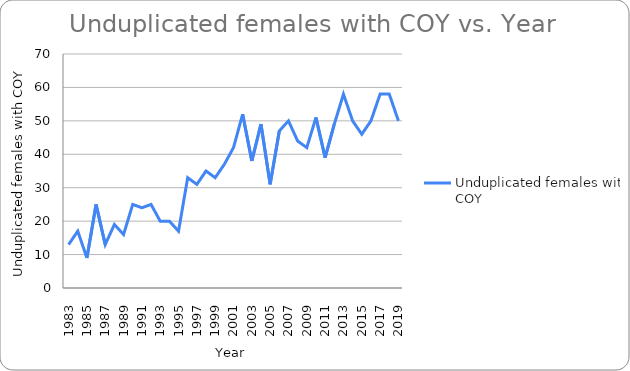
| Category | Unduplicated females with COY |
|---|---|
| 1983.0 | 13 |
| 1984.0 | 17 |
| 1985.0 | 9 |
| 1986.0 | 25 |
| 1987.0 | 13 |
| 1988.0 | 19 |
| 1989.0 | 16 |
| 1990.0 | 25 |
| 1991.0 | 24 |
| 1992.0 | 25 |
| 1993.0 | 20 |
| 1994.0 | 20 |
| 1995.0 | 17 |
| 1996.0 | 33 |
| 1997.0 | 31 |
| 1998.0 | 35 |
| 1999.0 | 33 |
| 2000.0 | 37 |
| 2001.0 | 42 |
| 2002.0 | 52 |
| 2003.0 | 38 |
| 2004.0 | 49 |
| 2005.0 | 31 |
| 2006.0 | 47 |
| 2007.0 | 50 |
| 2008.0 | 44 |
| 2009.0 | 42 |
| 2010.0 | 51 |
| 2011.0 | 39 |
| 2012.0 | 49 |
| 2013.0 | 58 |
| 2014.0 | 50 |
| 2015.0 | 46 |
| 2016.0 | 50 |
| 2017.0 | 58 |
| 2018.0 | 58 |
| 2019.0 | 50 |